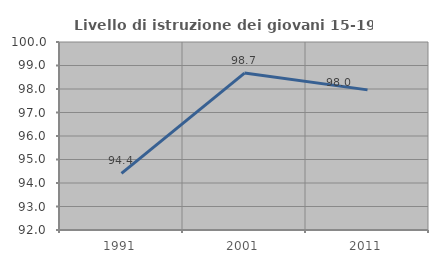
| Category | Livello di istruzione dei giovani 15-19 anni |
|---|---|
| 1991.0 | 94.412 |
| 2001.0 | 98.678 |
| 2011.0 | 97.963 |